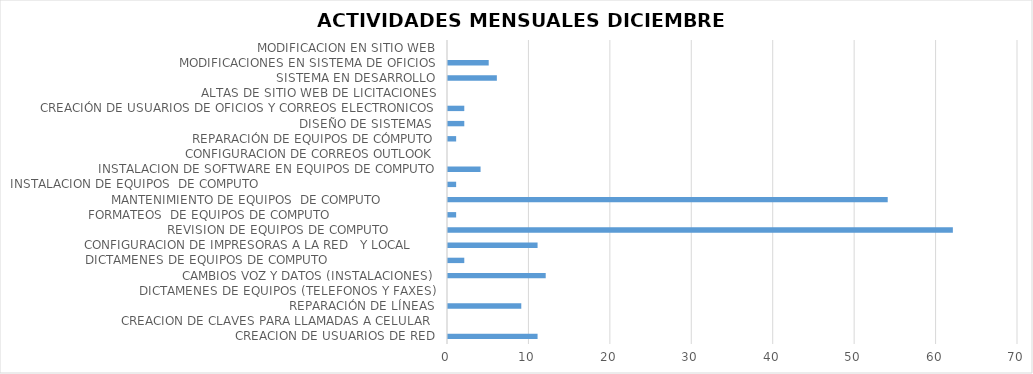
| Category | Series 0 |
|---|---|
| CREACION DE USUARIOS DE RED | 11 |
| CREACION DE CLAVES PARA LLAMADAS A CELULAR  | 0 |
| REPARACIÓN DE LÍNEAS | 9 |
| DICTAMENES DE EQUIPOS (TELEFONOS Y FAXES) | 0 |
| CAMBIOS VOZ Y DATOS (INSTALACIONES) | 12 |
| DICTAMENES DE EQUIPOS DE COMPUTO                             | 2 |
| CONFIGURACION DE IMPRESORAS A LA RED   Y LOCAL       | 11 |
| REVISION DE EQUIPOS DE COMPUTO             | 62 |
| FORMATEOS  DE EQUIPOS DE COMPUTO                            | 1 |
| MANTENIMIENTO DE EQUIPOS  DE COMPUTO               | 54 |
| INSTALACION DE EQUIPOS  DE COMPUTO                                               | 1 |
| INSTALACION DE SOFTWARE EN EQUIPOS DE COMPUTO | 4 |
| CONFIGURACION DE CORREOS OUTLOOK | 0 |
| REPARACIÓN DE EQUIPOS DE CÓMPUTO | 1 |
| DISEÑO DE SISTEMAS  | 2 |
| CREACIÓN DE USUARIOS DE OFICIOS Y CORREOS ELECTRONICOS | 2 |
| ALTAS DE SITIO WEB DE LICITACIONES | 0 |
| SISTEMA EN DESARROLLO | 6 |
| MODIFICACIONES EN SISTEMA DE OFICIOS | 5 |
| MODIFICACION EN SITIO WEB | 0 |